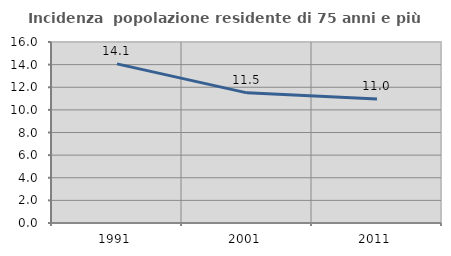
| Category | Incidenza  popolazione residente di 75 anni e più |
|---|---|
| 1991.0 | 14.064 |
| 2001.0 | 11.503 |
| 2011.0 | 10.959 |